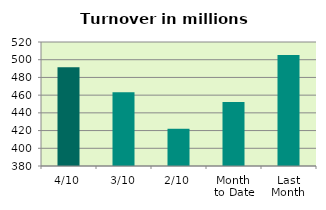
| Category | Series 0 |
|---|---|
| 4/10 | 491.418 |
| 3/10 | 463.404 |
| 2/10 | 422.037 |
| Month 
to Date | 452.214 |
| Last
Month | 505.274 |